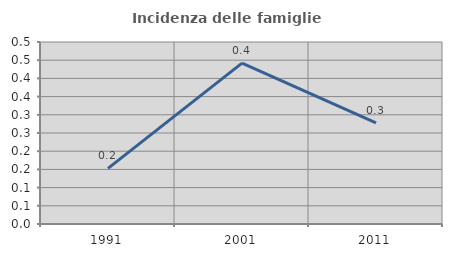
| Category | Incidenza delle famiglie numerose |
|---|---|
| 1991.0 | 0.153 |
| 2001.0 | 0.442 |
| 2011.0 | 0.278 |